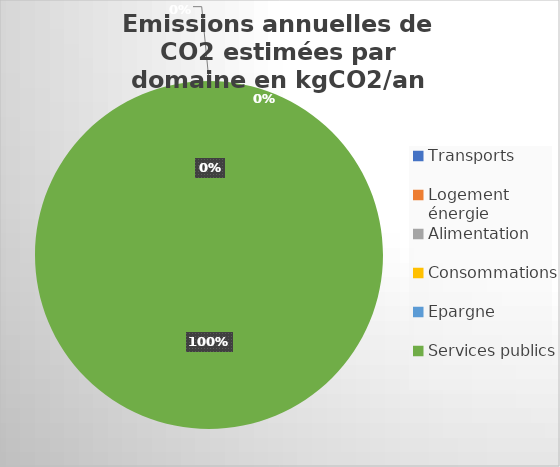
| Category | Series 0 |
|---|---|
| Transports | 0 |
| Logement énergie  | 0 |
| Alimentation | 0 |
| Consommations | 0 |
| Epargne | 0 |
| Services publics | 1283 |